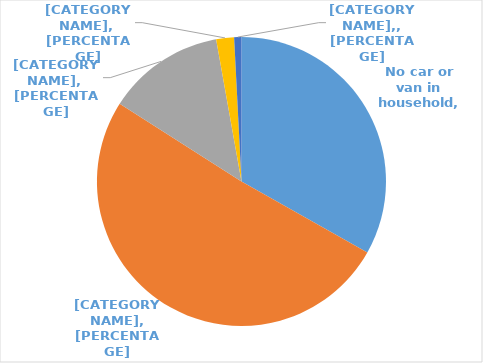
| Category | Series 0 |
|---|---|
| No car or van in household | 366 |
| 1 car or van per household | 561 |
| 2 cars or vans per household | 145 |
| 3 cars or vans per household | 22 |
| 4 cars or vans per household | 9 |